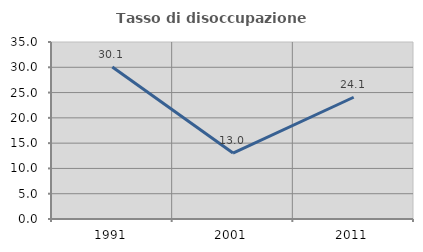
| Category | Tasso di disoccupazione giovanile  |
|---|---|
| 1991.0 | 30.065 |
| 2001.0 | 13.043 |
| 2011.0 | 24.074 |